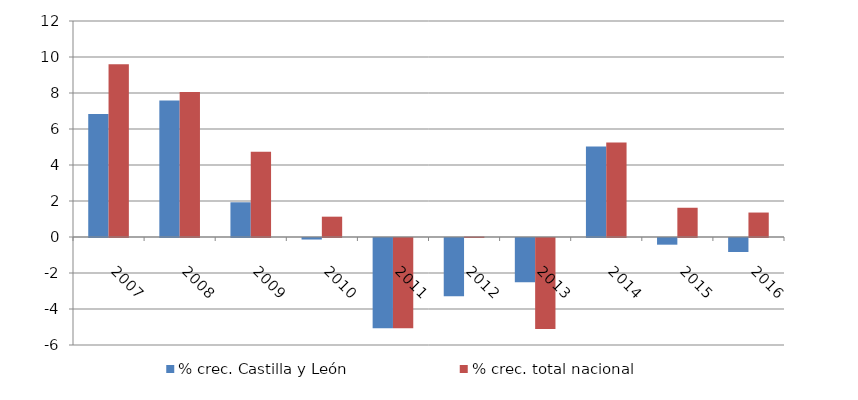
| Category | % crec. Castilla y León | % crec. total nacional |
|---|---|---|
| 2007.0 | 6.838 | 9.598 |
| 2008.0 | 7.581 | 8.052 |
| 2009.0 | 1.929 | 4.738 |
| 2010.0 | -0.085 | 1.129 |
| 2011.0 | -5.015 | -5.019 |
| 2012.0 | -3.236 | 0.024 |
| 2013.0 | -2.453 | -5.061 |
| 2014.0 | 5.022 | 5.255 |
| 2015.0 | -0.371 | 1.625 |
| 2016.0 | -0.777 | 1.359 |